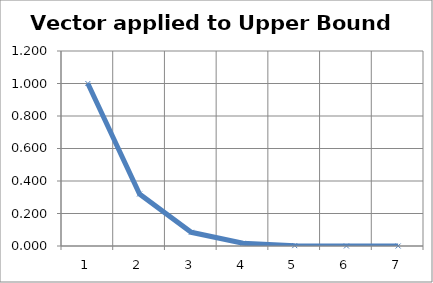
| Category | Series 0 |
|---|---|
| 0 | 1 |
| 1 | 0.32 |
| 2 | 0.084 |
| 3 | 0.017 |
| 4 | 0.002 |
| 5 | 0 |
| 6 | 0 |